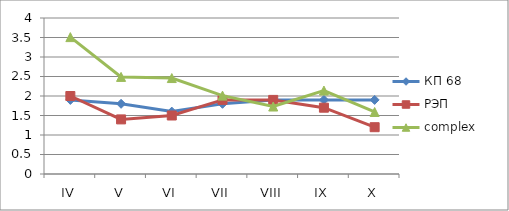
| Category | КП 68 | РЭП  | complex |
|---|---|---|---|
| IV | 1.9 | 2 | 3.51 |
| V | 1.8 | 1.4 | 2.49 |
| VI | 1.6 | 1.5 | 2.46 |
| VII | 1.8 | 1.9 | 2.01 |
| VIII | 1.9 | 1.9 | 1.73 |
| IX | 1.9 | 1.7 | 2.14 |
| X | 1.9 | 1.2 | 1.59 |